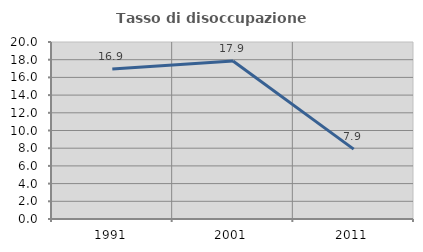
| Category | Tasso di disoccupazione giovanile  |
|---|---|
| 1991.0 | 16.949 |
| 2001.0 | 17.857 |
| 2011.0 | 7.895 |